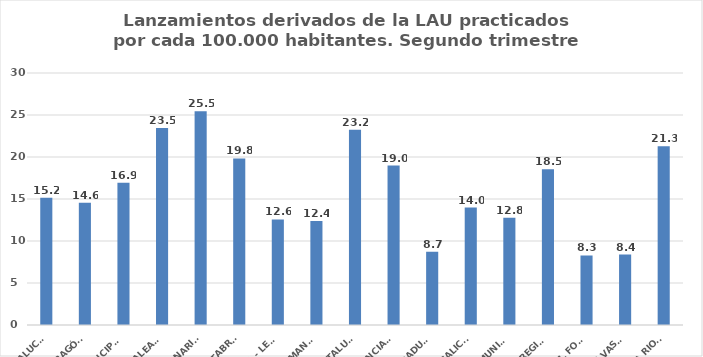
| Category | Series 0 |
|---|---|
| ANDALUCÍA | 15.158 |
| ARAGÓN | 14.562 |
| ASTURIAS, PRINCIPADO | 16.924 |
| ILLES BALEARS | 23.464 |
| CANARIAS | 25.455 |
| CANTABRIA | 19.822 |
| CASTILLA - LEÓN | 12.574 |
| CASTILLA - LA MANCHA | 12.377 |
| CATALUÑA | 23.242 |
| C. VALENCIANA | 18.975 |
| EXTREMADURA | 8.727 |
| GALICIA | 13.982 |
| MADRID, COMUNIDAD | 12.781 |
| MURCIA, REGIÓN | 18.545 |
| NAVARRA, COM. FORAL | 8.288 |
| PAÍS VASCO | 8.382 |
| LA RIOJA | 21.284 |